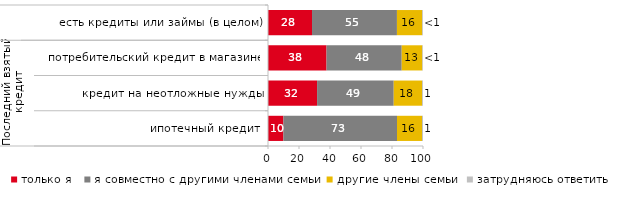
| Category | только я | я совместно с другими членами семьи | другие члены семьи | затрудняюсь ответить |
|---|---|---|---|---|
| 0 | 28.394 | 54.795 | 16.314 | 0.498 |
| 1 | 37.768 | 48.498 | 13.305 | 0.429 |
| 2 | 31.667 | 49.444 | 18.333 | 0.556 |
| 3 | 9.938 | 73.292 | 16.149 | 0.621 |